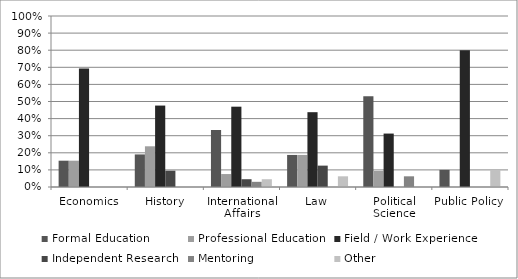
| Category | Formal Education | Professional Education | Field / Work Experience | Independent Research | Mentoring | Other |
|---|---|---|---|---|---|---|
| Economics | 0.154 | 0.154 | 0.692 | 0 | 0 | 0 |
| History | 0.19 | 0.238 | 0.476 | 0.095 | 0 | 0 |
| International Affairs | 0.333 | 0.076 | 0.47 | 0.045 | 0.03 | 0.045 |
| Law | 0.188 | 0.188 | 0.438 | 0.125 | 0 | 0.062 |
| Political Science | 0.531 | 0.094 | 0.312 | 0 | 0.062 | 0 |
| Public Policy | 0.1 | 0 | 0.8 | 0 | 0 | 0.1 |